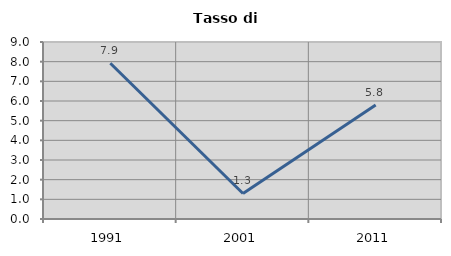
| Category | Tasso di disoccupazione   |
|---|---|
| 1991.0 | 7.921 |
| 2001.0 | 1.299 |
| 2011.0 | 5.797 |